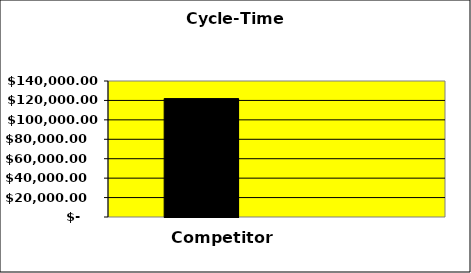
| Category | Series 0 | Series 1 | Series 2 |
|---|---|---|---|
| 0 | 121875 |  | 0 |